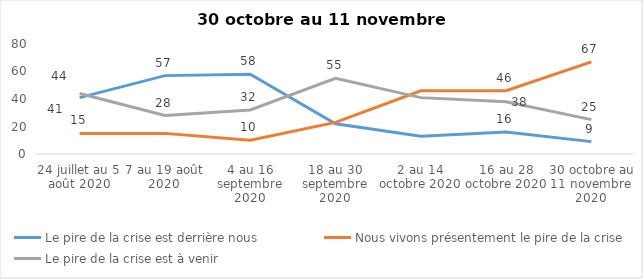
| Category | Le pire de la crise est derrière nous | Nous vivons présentement le pire de la crise | Le pire de la crise est à venir |
|---|---|---|---|
| 24 juillet au 5 août 2020 | 41 | 15 | 44 |
| 7 au 19 août 2020 | 57 | 15 | 28 |
| 4 au 16 septembre 2020 | 58 | 10 | 32 |
| 18 au 30 septembre 2020 | 22 | 23 | 55 |
| 2 au 14 octobre 2020 | 13 | 46 | 41 |
| 16 au 28 octobre 2020 | 16 | 46 | 38 |
| 30 octobre au 11 novembre 2020 | 9 | 67 | 25 |